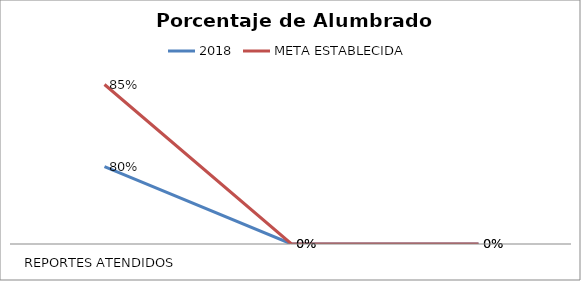
| Category | 2018 | META ESTABLECIDA |
|---|---|---|
| REPORTES ATENDIDOS | 0.8 | 0.85 |